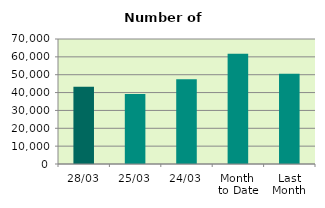
| Category | Series 0 |
|---|---|
| 28/03 | 43230 |
| 25/03 | 39254 |
| 24/03 | 47490 |
| Month 
to Date | 61804.6 |
| Last
Month | 50484.7 |